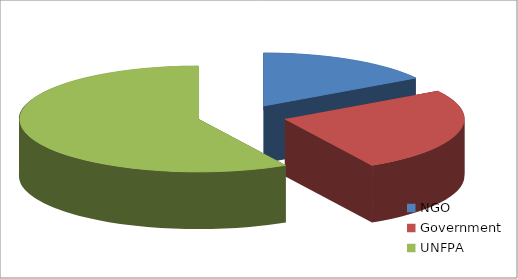
| Category | Series 0 |
|---|---|
| NGO | 5 |
| Government | 8 |
| UNFPA | 18 |